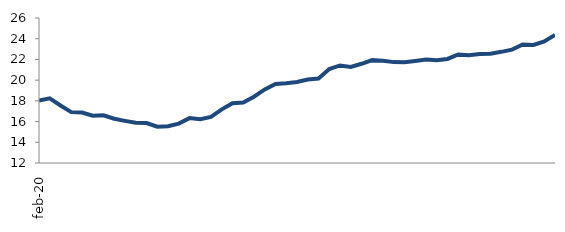
| Category | Series 0 |
|---|---|
| 2020-02-01 | 18.039 |
| 2020-03-01 | 18.244 |
| 2020-04-01 | 17.551 |
| 2020-05-01 | 16.911 |
| 2020-06-01 | 16.867 |
| 2020-07-01 | 16.563 |
| 2020-08-01 | 16.602 |
| 2020-09-01 | 16.272 |
| 2020-10-01 | 16.069 |
| 2020-11-01 | 15.889 |
| 2020-12-01 | 15.855 |
| 2021-01-01 | 15.501 |
| 2021-02-01 | 15.555 |
| 2021-03-01 | 15.803 |
| 2021-04-01 | 16.335 |
| 2021-05-01 | 16.232 |
| 2021-06-01 | 16.452 |
| 2021-07-01 | 17.177 |
| 2021-08-01 | 17.778 |
| 2021-09-01 | 17.842 |
| 2021-10-01 | 18.396 |
| 2021-11-01 | 19.101 |
| 2021-12-01 | 19.622 |
| 2022-01-01 | 19.702 |
| 2022-02-01 | 19.825 |
| 2022-03-01 | 20.061 |
| 2022-04-01 | 20.163 |
| 2022-05-01 | 21.067 |
| 2022-06-01 | 21.42 |
| 2022-07-01 | 21.282 |
| 2022-08-01 | 21.579 |
| 2022-09-01 | 21.932 |
| 2022-10-01 | 21.875 |
| 2022-11-01 | 21.741 |
| 2022-12-01 | 21.732 |
| 2023-01-01 | 21.858 |
| 2023-02-01 | 21.995 |
| 2023-03-01 | 21.919 |
| 2023-04-01 | 22.045 |
| 2023-05-01 | 22.483 |
| 2023-06-01 | 22.416 |
| 2023-07-01 | 22.523 |
| 2023-08-01 | 22.55 |
| 2023-09-01 | 22.733 |
| 2023-10-01 | 22.948 |
| 2023-11-01 | 23.44 |
| 2023-12-01 | 23.4 |
| 2024-01-01 | 23.742 |
| 2024-02-01 | 24.374 |